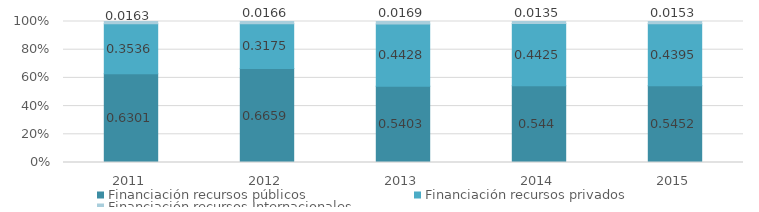
| Category | Financiación recursos públicos | Financiación recursos privados | Financiación recursos Internacionales |
|---|---|---|---|
| 2011.0 | 0.63 | 0.354 | 0.016 |
| 2012.0 | 0.666 | 0.318 | 0.017 |
| 2013.0 | 0.54 | 0.443 | 0.017 |
| 2014.0 | 0.544 | 0.442 | 0.014 |
| 2015.0 | 0.545 | 0.44 | 0.015 |